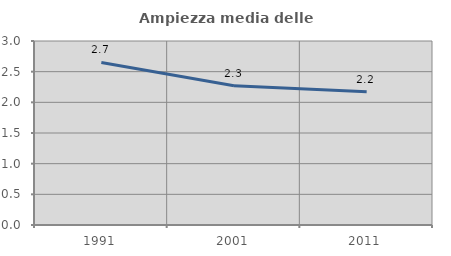
| Category | Ampiezza media delle famiglie |
|---|---|
| 1991.0 | 2.65 |
| 2001.0 | 2.272 |
| 2011.0 | 2.174 |